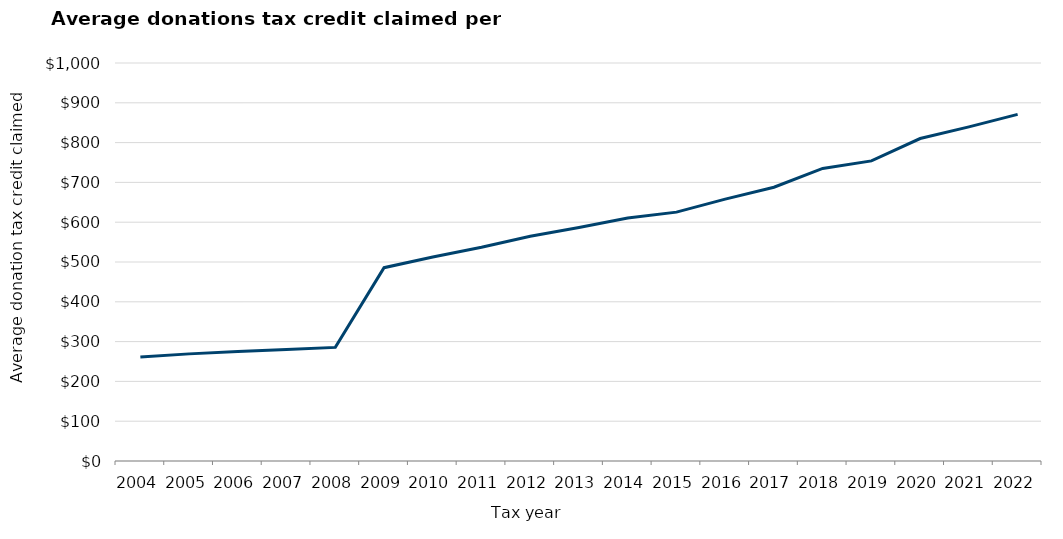
| Category | Series 0 |
|---|---|
| 2004.0 | 261.154 |
| 2005.0 | 269.153 |
| 2006.0 | 275.055 |
| 2007.0 | 280.028 |
| 2008.0 | 285.421 |
| 2009.0 | 485.757 |
| 2010.0 | 512.5 |
| 2011.0 | 537.1 |
| 2012.0 | 564.6 |
| 2013.0 | 586.5 |
| 2014.0 | 610.4 |
| 2015.0 | 625.3 |
| 2016.0 | 657.9 |
| 2017.0 | 687.8 |
| 2018.0 | 735.1 |
| 2019.0 | 754 |
| 2020.0 | 810.2 |
| 2021.0 | 839.566 |
| 2022.0 | 870.9 |